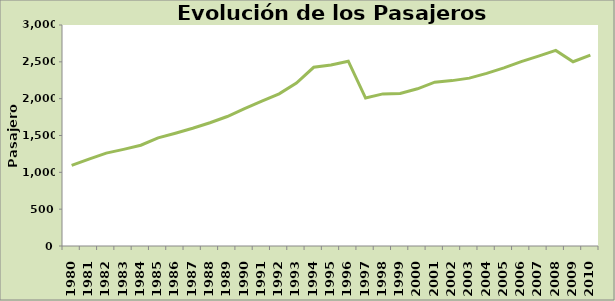
| Category | Series 0 |
|---|---|
| 1980.0 | 1094 |
| 1981.0 | 1180 |
| 1982.0 | 1261 |
| 1983.0 | 1312 |
| 1984.0 | 1368 |
| 1985.0 | 1468 |
| 1986.0 | 1531 |
| 1987.0 | 1599 |
| 1988.0 | 1673 |
| 1989.0 | 1758 |
| 1990.0 | 1865 |
| 1991.0 | 1965 |
| 1992.0 | 2066 |
| 1993.0 | 2212 |
| 1994.0 | 2426 |
| 1995.0 | 2457 |
| 1996.0 | 2509 |
| 1997.0 | 2008 |
| 1998.0 | 2065 |
| 1999.0 | 2070 |
| 2000.0 | 2134 |
| 2001.0 | 2224 |
| 2002.0 | 2245 |
| 2003.0 | 2279 |
| 2004.0 | 2344 |
| 2005.0 | 2418 |
| 2006.0 | 2503 |
| 2007.0 | 2578 |
| 2008.0 | 2655 |
| 2009.0 | 2501 |
| 2010.0 | 2591 |